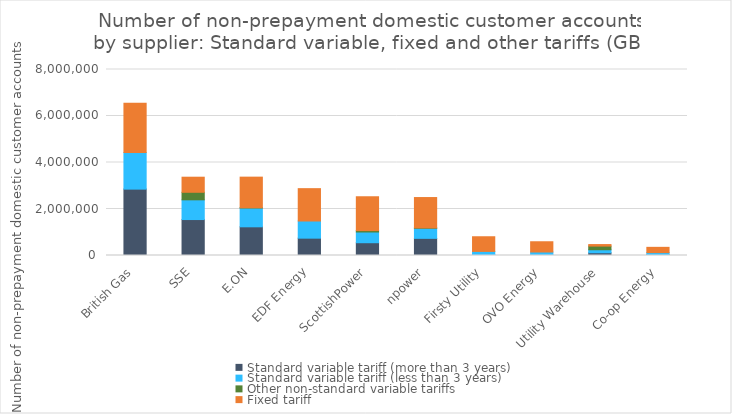
| Category | Standard variable tariff (more than 3 years) | Standard variable tariff (less than 3 years) | Other non-standard variable tariffs | Fixed tariff |
|---|---|---|---|---|
| British Gas | 2854952 | 1575115 | 0 | 2122713 |
| SSE | 1546202 | 848207 | 324709 | 648424 |
| E.ON | 1233876 | 809080 | 9367 | 1317898 |
| EDF Energy | 745608 | 738141 | 0 | 1391486 |
| ScottishPower | 549872 | 460799 | 60009 | 1456292 |
| npower | 737549 | 432376 | 14764 | 1308185 |
| Firsty Utility | 24170 | 151674 | 0 | 630804 |
| OVO Energy | 10606 | 139784 | 0 | 440881 |
| Utility Warehouse | 118653 | 128656 | 157208 | 65950 |
| Co-op Energy | 32606 | 91627 | 0 | 226806 |